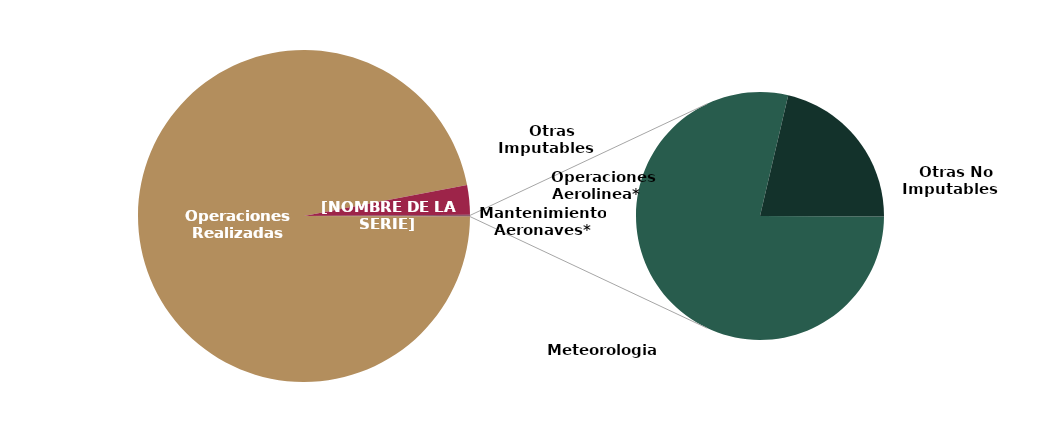
| Category | Cancelaciones |
|---|---|
| Operaciones Realizadas | 410401 |
|    Operaciones Aerolinea* | 12200 |
|    Mantenimiento Aeronaves* | 191 |
|    Otras Imputables | 46 |
|    Meteorologia | 371 |
|    Otras No Imputables | 101 |